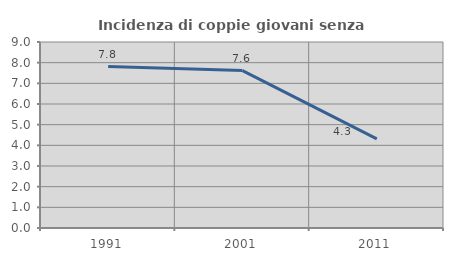
| Category | Incidenza di coppie giovani senza figli |
|---|---|
| 1991.0 | 7.811 |
| 2001.0 | 7.615 |
| 2011.0 | 4.315 |